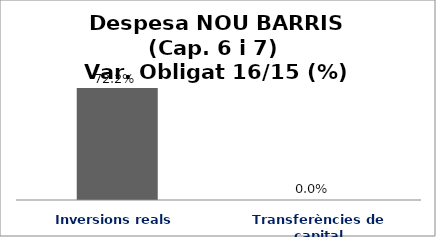
| Category | Series 0 |
|---|---|
| Inversions reals | 0.722 |
| Transferències de capital | 0 |